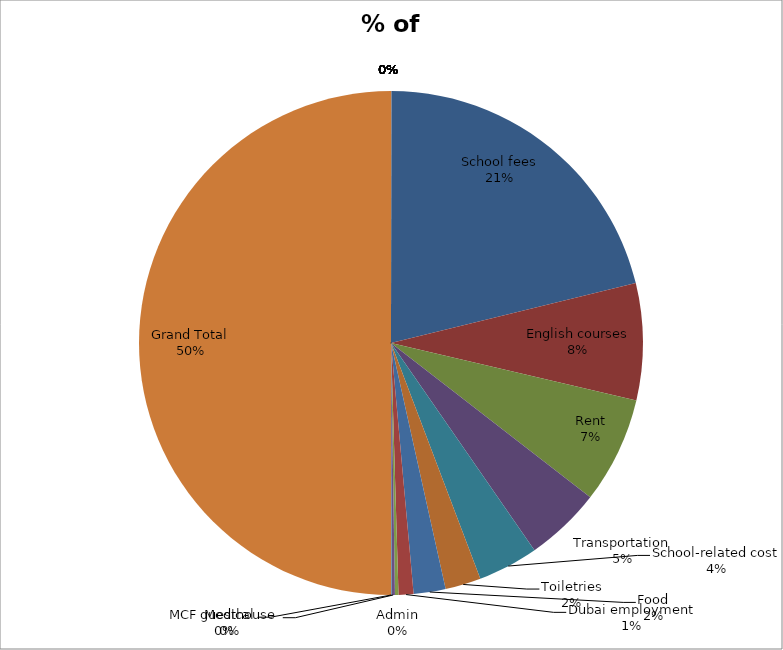
| Category | % of Expenses |
|---|---|
| School fees | 0.424 |
| English courses | 0.15 |
| Rent | 0.137 |
| Transportation | 0.097 |
| School-related cost | 0.077 |
| Toiletries | 0.046 |
| Food | 0.041 |
| Dubai employment | 0.019 |
| Admin | 0.004 |
| MCF guesthouse | 0.004 |
| Medical | 0.001 |
| Grand Total | 1 |